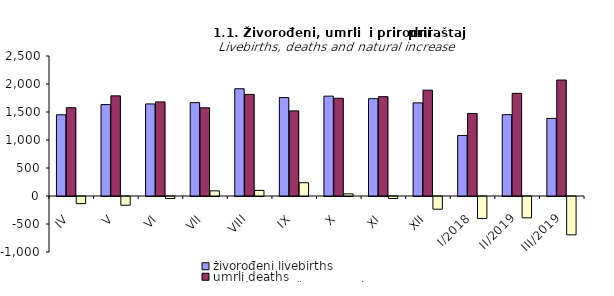
| Category | živorođeni livebirths | umrli deaths | prirodni proraštaj natural increase |
|---|---|---|---|
| IV | 1450 | 1577 | -127 |
| V | 1632 | 1788 | -156 |
| VI | 1644 | 1680 | -36 |
| VII | 1667 | 1575 | 92 |
| VIII | 1915 | 1815 | 100 |
| IX | 1757 | 1520 | 237 |
| X | 1783 | 1745 | 38 |
| XI | 1738 | 1774 | -36 |
| XII | 1663 | 1890 | -227 |
| I/2018 | 1081 | 1474 | -393 |
| II/2019 | 1452 | 1833 | -381 |
| III/2019 | 1386 | 2071 | -685 |